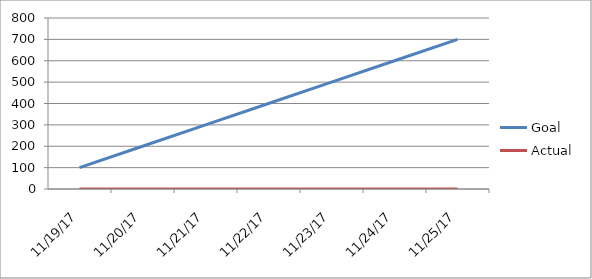
| Category | Goal | Actual |
|---|---|---|
| 2017-11-19 | 100 | 0 |
| 2017-11-20 | 200 | 0 |
| 2017-11-21 | 300 | 0 |
| 2017-11-22 | 400 | 0 |
| 2017-11-23 | 500 | 0 |
| 2017-11-24 | 600 | 0 |
| 2017-11-25 | 700 | 0 |